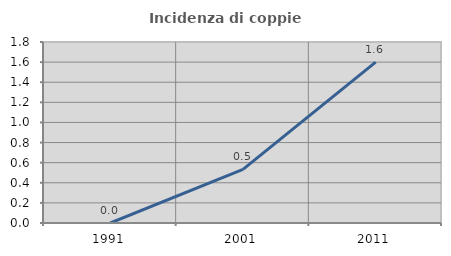
| Category | Incidenza di coppie miste |
|---|---|
| 1991.0 | 0 |
| 2001.0 | 0.533 |
| 2011.0 | 1.599 |